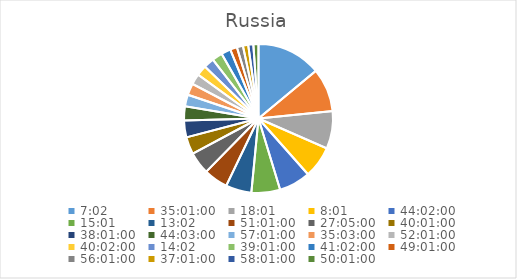
| Category | Series 0 |
|---|---|
| 0.29305555555555557 | 13.872 |
| 1.4590277777777778 | 9.393 |
| 0.7506944444444444 | 8.079 |
| 0.3340277777777778 | 6.854 |
| 1.8347222222222221 | 6.806 |
| 0.6256944444444444 | 6.187 |
| 0.5430555555555555 | 5.553 |
| 2.1256944444444446 | 5.196 |
| 1.128472222222222 | 4.805 |
| 1.667361111111111 | 3.707 |
| 1.5840277777777778 | 3.635 |
| 1.8354166666666665 | 3.021 |
| 2.3756944444444446 | 2.521 |
| 1.4604166666666665 | 2.495 |
| 2.167361111111111 | 2.3 |
| 1.6680555555555554 | 2.255 |
| 0.5847222222222223 | 2.238 |
| 1.6256944444444443 | 2.233 |
| 1.7097222222222221 | 2.048 |
| 2.042361111111111 | 1.479 |
| 2.3340277777777776 | 1.314 |
| 1.542361111111111 | 1.141 |
| 2.417361111111111 | 1.102 |
| 2.0840277777777776 | 1.102 |